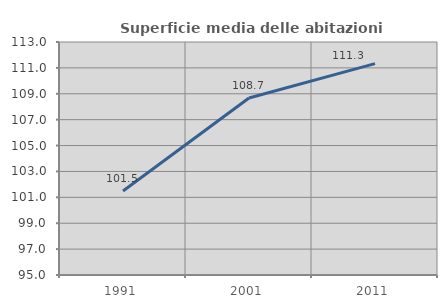
| Category | Superficie media delle abitazioni occupate |
|---|---|
| 1991.0 | 101.485 |
| 2001.0 | 108.668 |
| 2011.0 | 111.327 |